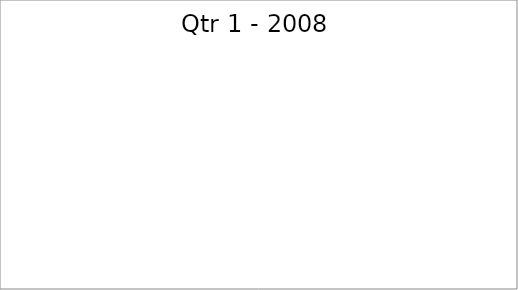
| Category | Series 0 |
|---|---|
| Budget | 1600 |
| Projected | 1040 |
| Actual | 1450 |
| Forecast | 2500 |